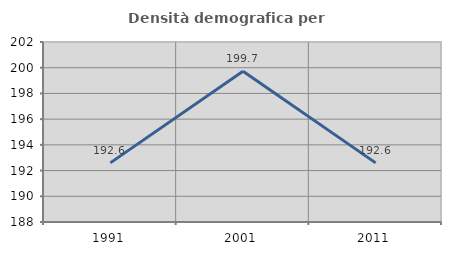
| Category | Densità demografica |
|---|---|
| 1991.0 | 192.6 |
| 2001.0 | 199.733 |
| 2011.0 | 192.6 |